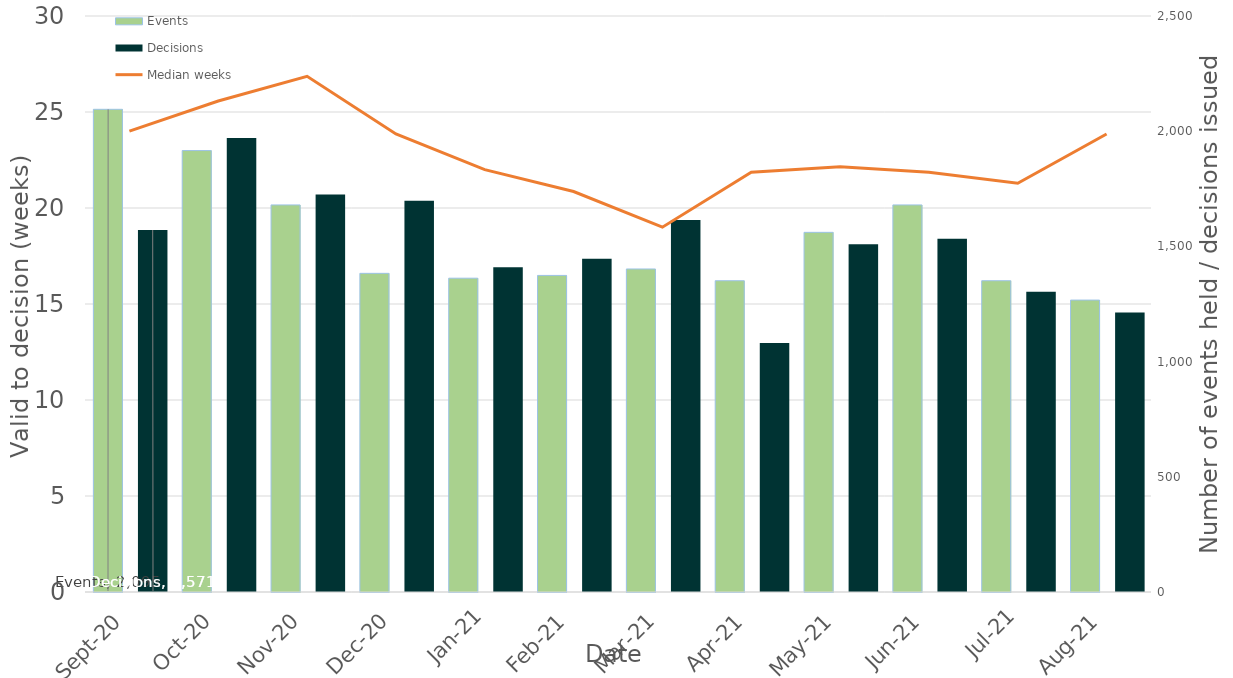
| Category | Events | Decisions |
|---|---|---|
| 0 | 2095 | 1571 |
| 1900-01-01 | 1916 | 1971 |
| 1900-01-02 | 1680 | 1725 |
| 1900-01-03 | 1383 | 1698 |
| 1900-01-04 | 1362 | 1410 |
| 1900-01-05 | 1374 | 1446 |
| 1900-01-06 | 1402 | 1615 |
| 1900-01-07 | 1351 | 1081 |
| 1900-01-08 | 1561 | 1509 |
| 1900-01-09 | 1680 | 1533 |
| 1900-01-10 | 1351 | 1303 |
| 1900-01-11 | 1267 | 1213 |